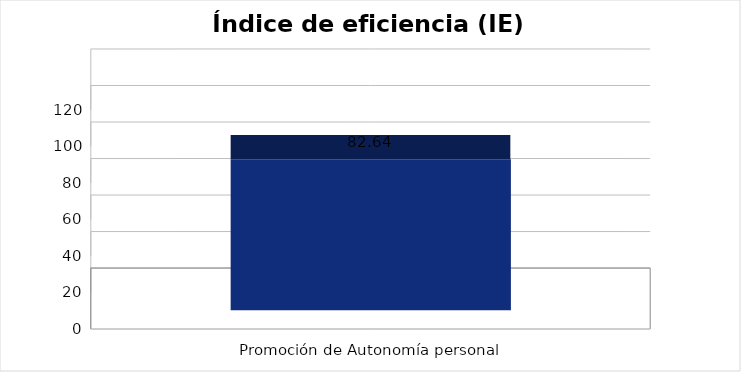
| Category | Índice de eficiencia (IE)  |
|---|---|
| Promoción de Autonomía personal  | 82.64 |